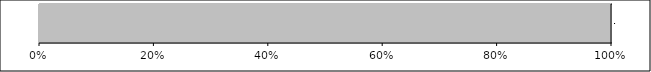
| Category | Series 0 | Series 1 | Series 2 | Series 3 | Series 4 |
|---|---|---|---|---|---|
| 0 | 0 | 0 | 0 | 0 | 7 |